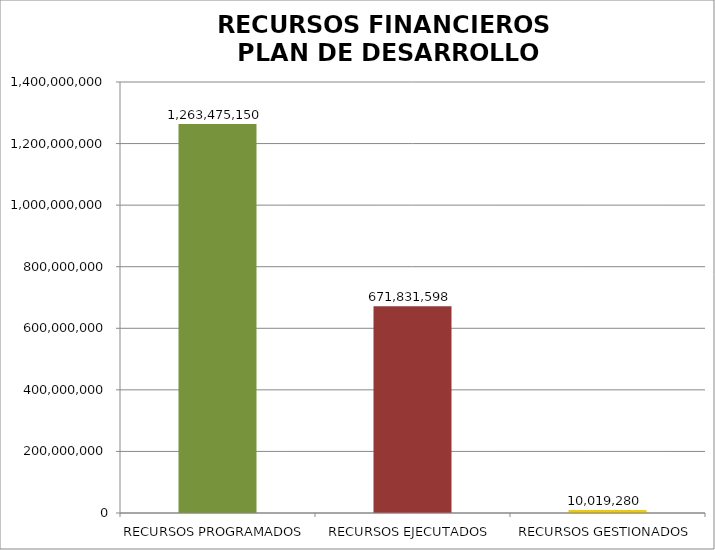
| Category | Series 0 |
|---|---|
| RECURSOS PROGRAMADOS | 1263475150.309 |
| RECURSOS EJECUTADOS | 671831598.484 |
| RECURSOS GESTIONADOS | 10019280 |